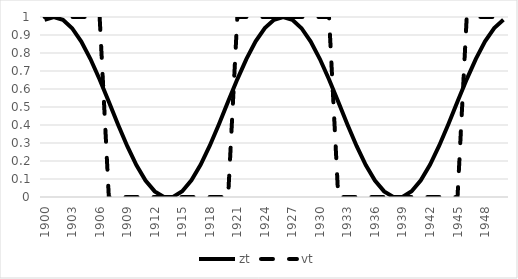
| Category | zt | vt |
|---|---|---|
| 1900-01-01 | 0.984 | 1 |
| 1901-01-01 | 1 | 1 |
| 1902-01-01 | 0.984 | 1 |
| 1903-01-01 | 0.938 | 1 |
| 1904-01-01 | 0.864 | 1 |
| 1905-01-01 | 0.766 | 1 |
| 1906-01-01 | 0.653 | 1 |
| 1907-01-01 | 0.529 | 0 |
| 1908-01-01 | 0.403 | 0 |
| 1909-01-01 | 0.284 | 0 |
| 1910-01-01 | 0.178 | 0 |
| 1911-01-01 | 0.092 | 0 |
| 1912-01-01 | 0.031 | 0 |
| 1913-01-01 | 0 | 0 |
| 1914-01-01 | 0 | 0 |
| 1915-01-01 | 0.032 | 0 |
| 1916-01-01 | 0.092 | 0 |
| 1917-01-01 | 0.179 | 0 |
| 1918-01-01 | 0.285 | 0 |
| 1919-01-01 | 0.405 | 0 |
| 1920-01-01 | 0.53 | 0 |
| 1921-01-01 | 0.654 | 1 |
| 1922-01-01 | 0.768 | 1 |
| 1923-01-01 | 0.864 | 1 |
| 1924-01-01 | 0.938 | 1 |
| 1925-01-01 | 0.984 | 1 |
| 1926-01-01 | 1 | 1 |
| 1927-01-01 | 0.984 | 1 |
| 1928-01-01 | 0.938 | 1 |
| 1929-01-01 | 0.864 | 1 |
| 1930-01-01 | 0.766 | 1 |
| 1931-01-01 | 0.653 | 1 |
| 1932-01-01 | 0.529 | 0 |
| 1933-01-01 | 0.403 | 0 |
| 1934-01-01 | 0.284 | 0 |
| 1935-01-01 | 0.178 | 0 |
| 1936-01-01 | 0.092 | 0 |
| 1937-01-01 | 0.031 | 0 |
| 1938-01-01 | 0 | 0 |
| 1939-01-01 | 0 | 0 |
| 1940-01-01 | 0.032 | 0 |
| 1941-01-01 | 0.092 | 0 |
| 1942-01-01 | 0.179 | 0 |
| 1943-01-01 | 0.285 | 0 |
| 1944-01-01 | 0.405 | 0 |
| 1945-01-01 | 0.53 | 0 |
| 1946-01-01 | 0.654 | 1 |
| 1947-01-01 | 0.768 | 1 |
| 1948-01-01 | 0.864 | 1 |
| 1949-01-01 | 0.938 | 1 |
| 1950-01-01 | 0.984 | 1 |